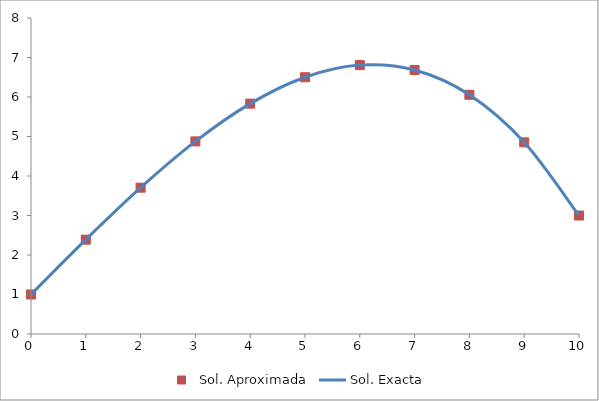
| Category | Sol. Aproximada |
|---|---|
| 0.0 | 1 |
| 1.0 | 2.388 |
| 2.0 | 3.704 |
| 3.0 | 4.876 |
| 4.0 | 5.832 |
| 5.0 | 6.5 |
| 6.0 | 6.808 |
| 7.0 | 6.684 |
| 8.0 | 6.056 |
| 9.0 | 4.852 |
| 10.0 | 3 |